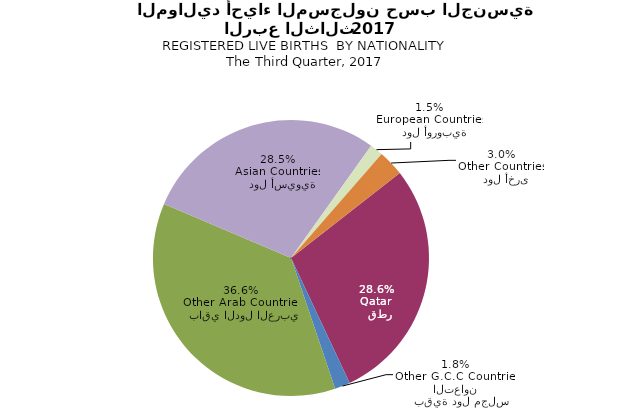
| Category | Series 0 |
|---|---|
|   قطر
Qatar | 1933 |
|   بقية دول مجلس التعاون
Other G.C.C Countries | 122 |
|   باقي الدول العربية
Other Arab Countries | 2476 |
|   دول أسيوية
Asian Countries | 1925 |
|   دول أوروبية
European Countries | 104 |
|   دول أخرى
Other Countries | 206 |